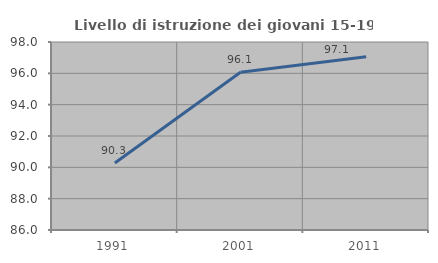
| Category | Livello di istruzione dei giovani 15-19 anni |
|---|---|
| 1991.0 | 90.272 |
| 2001.0 | 96.072 |
| 2011.0 | 97.054 |